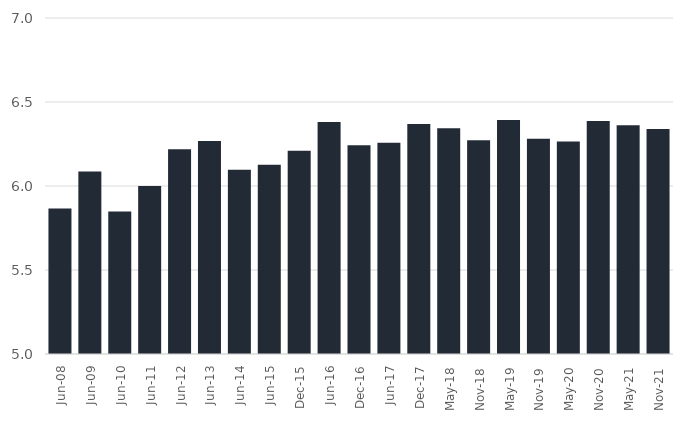
| Category | Series 0 |
|---|---|
| 2008-06-01 | 5.866 |
| 2009-06-01 | 6.086 |
| 2010-06-01 | 5.848 |
| 2011-06-01 | 6 |
| 2012-06-01 | 6.219 |
| 2013-06-01 | 6.268 |
| 2014-06-01 | 6.097 |
| 2015-06-01 | 6.127 |
| 2015-12-01 | 6.211 |
| 2016-06-01 | 6.382 |
| 2016-12-01 | 6.243 |
| 2017-06-01 | 6.257 |
| 2017-12-01 | 6.368 |
| 2018-05-01 | 6.344 |
| 2018-11-01 | 6.272 |
| 2019-05-01 | 6.392 |
| 2019-11-01 | 6.281 |
| 2020-05-01 | 6.265 |
| 2020-11-01 | 6.388 |
| 2021-05-01 | 6.362 |
| 2021-11-01 | 6.34 |